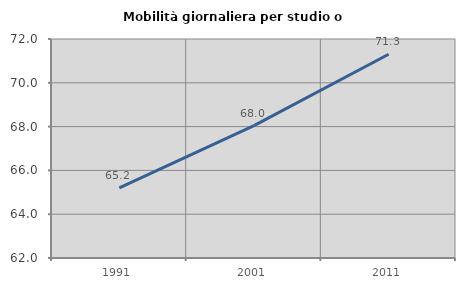
| Category | Mobilità giornaliera per studio o lavoro |
|---|---|
| 1991.0 | 65.206 |
| 2001.0 | 68.045 |
| 2011.0 | 71.304 |